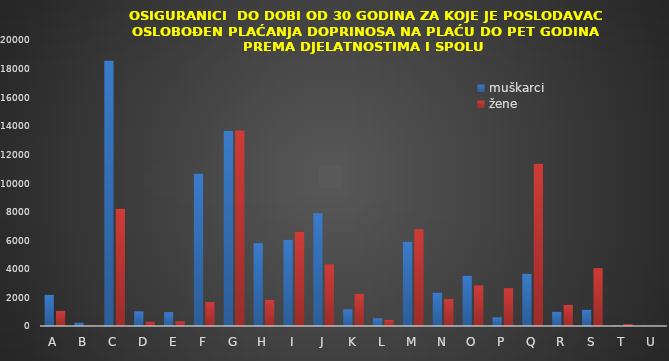
| Category | muškarci | žene |
|---|---|---|
| A | 2184 | 1061 |
| B | 241 | 28 |
| C | 18564 | 8194 |
| D | 1026 | 314 |
| E | 973 | 330 |
| F | 10661 | 1673 |
| G | 13647 | 13676 |
| H | 5794 | 1833 |
| I | 6029 | 6607 |
| J | 7883 | 4309 |
| K | 1164 | 2257 |
| L | 542 | 429 |
| M | 5907 | 6769 |
| N | 2341 | 1884 |
| O | 3518 | 2840 |
| P | 607 | 2644 |
| Q | 3656 | 11341 |
| R | 997 | 1476 |
| S | 1134 | 4044 |
| T | 23 | 129 |
| U | 12 | 14 |